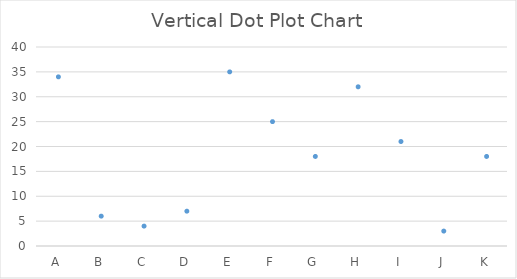
| Category | Value |
|---|---|
| A | 34 |
| B | 6 |
| C | 4 |
| D | 7 |
| E | 35 |
| F | 25 |
| G | 18 |
| H | 32 |
| I | 21 |
| J | 3 |
| K | 18 |